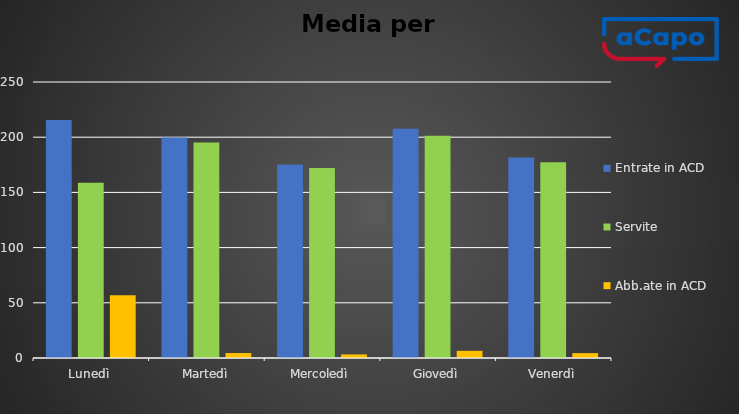
| Category | Entrate in ACD | Servite | Abb.ate in ACD |
|---|---|---|---|
| Lunedì | 215.5 | 158.75 | 56.75 |
| Martedì | 199.75 | 195.25 | 4.5 |
| Mercoledì | 175.25 | 172 | 3.25 |
| Giovedì | 207.75 | 201.25 | 6.5 |
| Venerdì | 181.6 | 177.2 | 4.4 |